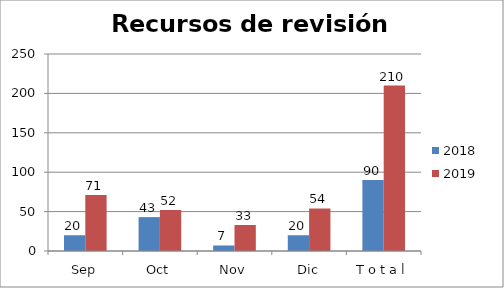
| Category | 2018 | 2019 |
|---|---|---|
| Sep | 20 | 71 |
| Oct | 43 | 52 |
| Nov | 7 | 33 |
| Dic | 20 | 54 |
| T o t a l | 90 | 210 |